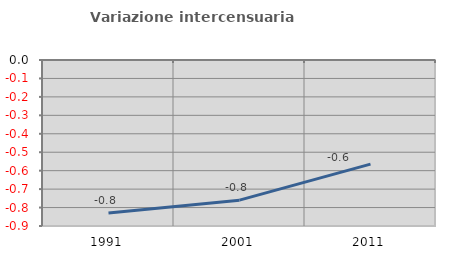
| Category | Variazione intercensuaria annua |
|---|---|
| 1991.0 | -0.83 |
| 2001.0 | -0.76 |
| 2011.0 | -0.565 |